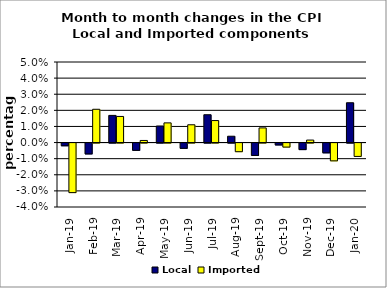
| Category | Local | Imported |
|---|---|---|
| 2019-01-01 | -0.002 | -0.031 |
| 2019-02-01 | -0.007 | 0.021 |
| 2019-03-01 | 0.017 | 0.016 |
| 2019-04-01 | -0.005 | 0.001 |
| 2019-05-01 | 0.01 | 0.012 |
| 2019-06-01 | -0.003 | 0.011 |
| 2019-07-01 | 0.017 | 0.014 |
| 2019-08-01 | 0.004 | -0.005 |
| 2019-09-01 | -0.008 | 0.009 |
| 2019-10-01 | -0.001 | -0.003 |
| 2019-11-01 | -0.004 | 0.002 |
| 2019-12-01 | -0.006 | -0.011 |
| 2020-01-01 | 0.025 | -0.008 |